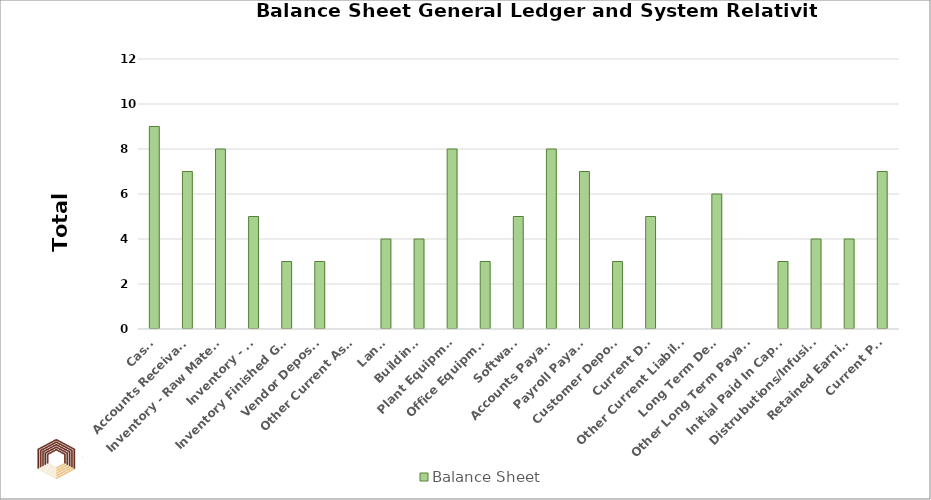
| Category | Balance Sheet  |
|---|---|
| Cash  | 9 |
| Accounts Receivable  | 7 |
| Inventory - Raw Materals  | 8 |
| Inventory - WIP  | 5 |
| Inventory Finished Goods | 3 |
| Vendor Deposits  | 3 |
| Other Current Assets | 0 |
| Land  | 4 |
| Buildings  | 4 |
| Plant Equipment  | 8 |
| Office Equipment  | 3 |
| Software  | 5 |
| Accounts Payable  | 8 |
| Payroll Payable  | 7 |
| Customer Deposits | 3 |
| Current Debt | 5 |
| Other Current Liabilities | 0 |
| Long Term Debt  | 6 |
| Other Long Term Payables | 0 |
| Initial Paid In Capital  | 3 |
| Distrubutions/Infusions  | 4 |
| Retained Earnings | 4 |
| Current P&L | 7 |